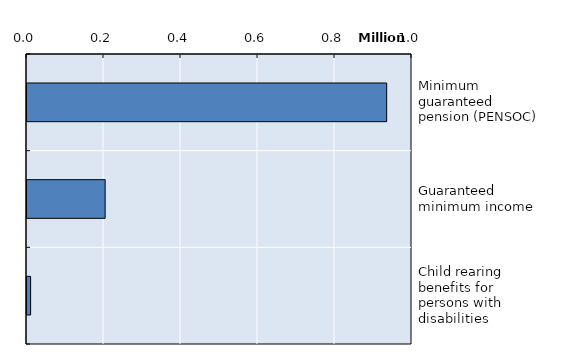
| Category | Series 0 |
|---|---|
| Minimum guaranteed pension (PENSOC) | 934253 |
| Guaranteed minimum income | 202976 |
| Child rearing benefits for persons with disabilities | 9389 |